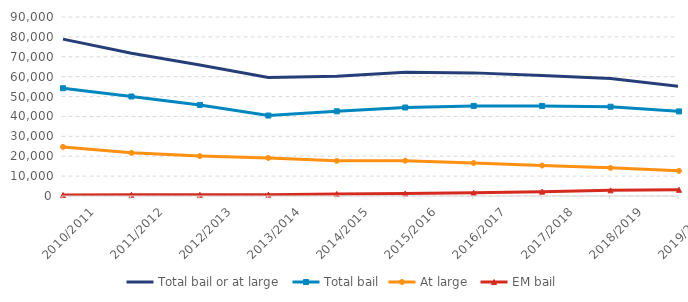
| Category | Total bail or at large | Total bail | At large | EM bail |
|---|---|---|---|---|
| 2010/2011 | 78877 | 54195 | 24682 | 500 |
| 2011/2012 | 71737 | 50025 | 21712 | 604 |
| 2012/2013 | 65872 | 45802 | 20070 | 603 |
| 2013/2014 | 59584 | 40456 | 19128 | 691 |
| 2014/2015 | 60255 | 42591 | 17664 | 1018 |
| 2015/2016 | 62250 | 44496 | 17754 | 1283 |
| 2016/2017 | 61906 | 45311 | 16595 | 1619 |
| 2017/2018 | 60635 | 45296 | 15339 | 2199 |
| 2018/2019 | 59020 | 44877 | 14143 | 2849 |
| 2019/2020 | 55169 | 42527 | 12642 | 3117 |